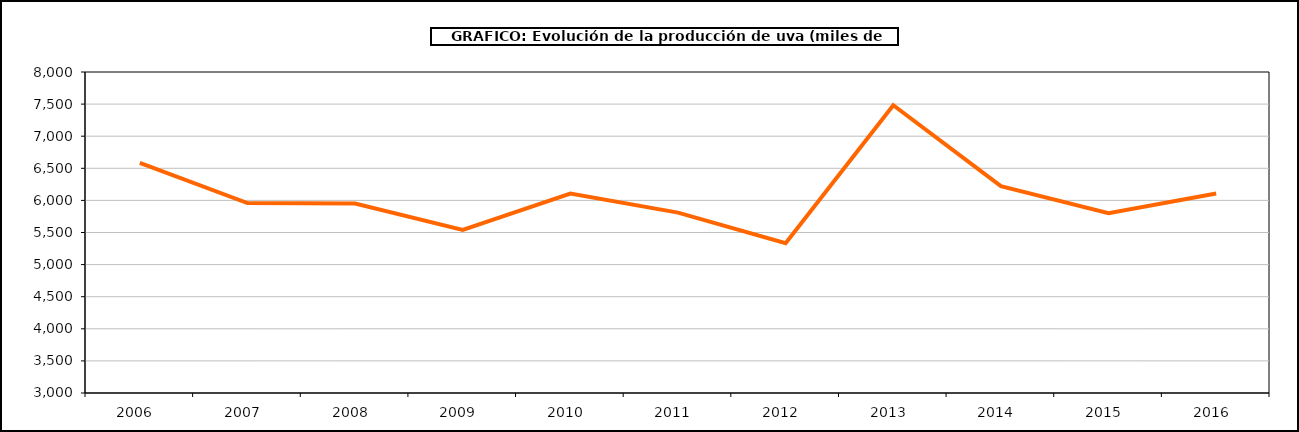
| Category | producción |
|---|---|
| 2006  | 6585.481 |
| 2007  | 5958.705 |
| 2008  | 5951.581 |
| 2009  | 5538.893 |
| 2010  | 6107.616 |
| 2011  | 5809.315 |
| 2012  | 5332.163 |
| 2013  | 7482.539 |
| 2014  | 6221.76 |
| 2015  | 5799.127 |
| 2016  | 6108.851 |